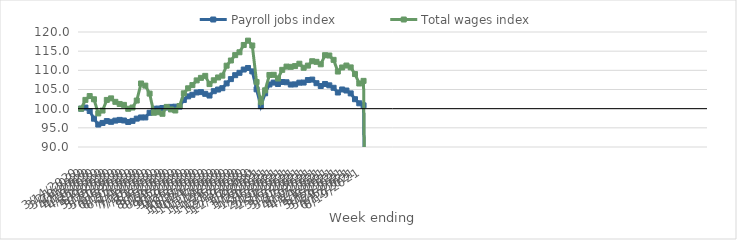
| Category | Payroll jobs index | Total wages index |
|---|---|---|
| 14/03/2020 | 100 | 100 |
| 21/03/2020 | 100.288 | 102.286 |
| 28/03/2020 | 99.388 | 103.292 |
| 04/04/2020 | 97.388 | 102.449 |
| 11/04/2020 | 95.852 | 98.761 |
| 18/04/2020 | 96.273 | 99.506 |
| 25/04/2020 | 96.76 | 102.278 |
| 02/05/2020 | 96.564 | 102.684 |
| 09/05/2020 | 96.886 | 101.78 |
| 16/05/2020 | 97.069 | 101.228 |
| 23/05/2020 | 96.916 | 100.986 |
| 30/05/2020 | 96.524 | 99.973 |
| 06/06/2020 | 96.812 | 100.293 |
| 13/06/2020 | 97.4 | 102.122 |
| 20/06/2020 | 97.708 | 106.571 |
| 27/06/2020 | 97.709 | 106.011 |
| 04/07/2020 | 98.919 | 103.932 |
| 11/07/2020 | 99.976 | 98.931 |
| 18/07/2020 | 100.028 | 99.074 |
| 25/07/2020 | 100.178 | 98.665 |
| 01/08/2020 | 100.294 | 100.462 |
| 08/08/2020 | 100.466 | 99.798 |
| 15/08/2020 | 100.52 | 99.524 |
| 22/08/2020 | 100.535 | 100.683 |
| 29/08/2020 | 102.268 | 104.003 |
| 05/09/2020 | 103.203 | 105.315 |
| 12/09/2020 | 103.622 | 106.153 |
| 19/09/2020 | 104.228 | 107.375 |
| 26/09/2020 | 104.322 | 108.039 |
| 03/10/2020 | 103.869 | 108.554 |
| 10/10/2020 | 103.426 | 106.414 |
| 17/10/2020 | 104.562 | 107.408 |
| 24/10/2020 | 104.984 | 108.142 |
| 31/10/2020 | 105.342 | 108.609 |
| 07/11/2020 | 106.588 | 111.213 |
| 14/11/2020 | 107.713 | 112.564 |
| 21/11/2020 | 108.735 | 113.969 |
| 28/11/2020 | 109.352 | 114.71 |
| 05/12/2020 | 110.207 | 116.614 |
| 12/12/2020 | 110.609 | 117.749 |
| 19/12/2020 | 109.725 | 116.481 |
| 26/12/2020 | 105.041 | 106.954 |
| 02/01/2021 | 100.666 | 101.766 |
| 09/01/2021 | 104.004 | 104.79 |
| 16/01/2021 | 106.314 | 108.79 |
| 23/01/2021 | 106.803 | 108.824 |
| 30/01/2021 | 106.437 | 107.873 |
| 06/02/2021 | 106.955 | 110.124 |
| 13/02/2021 | 106.885 | 110.979 |
| 20/02/2021 | 106.293 | 110.909 |
| 27/02/2021 | 106.338 | 111.111 |
| 06/03/2021 | 106.781 | 111.724 |
| 13/03/2021 | 106.814 | 110.676 |
| 20/03/2021 | 107.47 | 111.235 |
| 27/03/2021 | 107.587 | 112.374 |
| 03/04/2021 | 106.641 | 112.217 |
| 10/04/2021 | 105.914 | 111.571 |
| 17/04/2021 | 106.439 | 113.95 |
| 24/04/2021 | 106.088 | 113.864 |
| 01/05/2021 | 105.446 | 112.735 |
| 08/05/2021 | 104.215 | 109.685 |
| 15/05/2021 | 105.006 | 110.743 |
| 22/05/2021 | 104.733 | 111.249 |
| 29/05/2021 | 103.982 | 110.767 |
| 05/06/2021 | 102.468 | 109.03 |
| 12/06/2021 | 101.399 | 106.563 |
| 19/06/2021 | 100.864 | 107.253 |